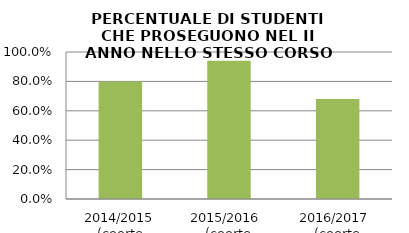
| Category | 2014/2015 (coorte 2013/14) 2015/2016  (coorte 2014/15) 2016/2017  (coorte 2015/16) |
|---|---|
| 2014/2015 (coorte 2013/14) | 0.8 |
| 2015/2016  (coorte 2014/15) | 0.941 |
| 2016/2017  (coorte 2015/16) | 0.68 |